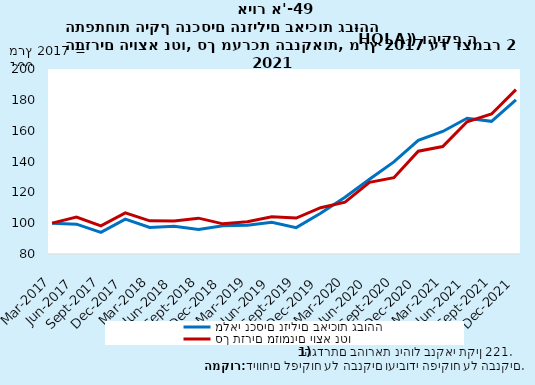
| Category | מלאי נכסים נזילים באיכות גבוהה | סך תזרים מזומנים יוצא נטו |
|---|---|---|
| 2017-03-31 | 100 | 100 |
| 2017-06-30 | 99.341 | 103.899 |
| 2017-09-30 | 93.99 | 98.272 |
| 2017-12-31 | 102.639 | 106.646 |
| 2018-03-31 | 97.271 | 101.52 |
| 2018-06-30 | 98.026 | 101.362 |
| 2018-09-30 | 95.91 | 103.248 |
| 2018-12-31 | 98.254 | 99.554 |
| 2019-03-31 | 98.587 | 100.947 |
| 2019-06-30 | 100.61 | 104.172 |
| 2019-09-30 | 97.089 | 103.342 |
| 2019-12-31 | 106.389 | 110.015 |
| 2020-03-31 | 116.847 | 113.633 |
| 2020-06-30 | 128.52 | 126.519 |
| 2020-09-30 | 139.75 | 129.513 |
| 2020-12-31 | 153.732 | 146.696 |
| 2021-03-31 | 159.461 | 149.671 |
| 2021-06-30 | 168.045 | 165.755 |
| 2021-09-30 | 166.04 | 170.785 |
| 2021-12-31 | 179.896 | 186.609 |